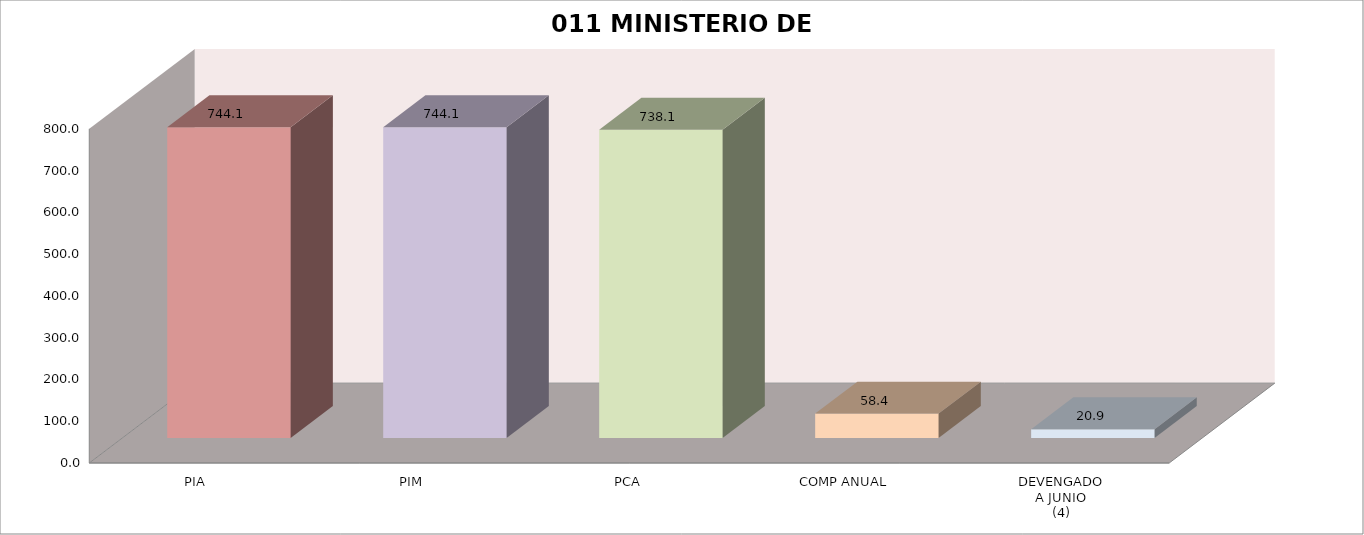
| Category | 011 MINISTERIO DE SALUD |
|---|---|
| PIA | 744.088 |
| PIM | 744.088 |
| PCA | 738.088 |
| COMP ANUAL | 58.416 |
| DEVENGADO
A JUNIO
(4) | 20.921 |